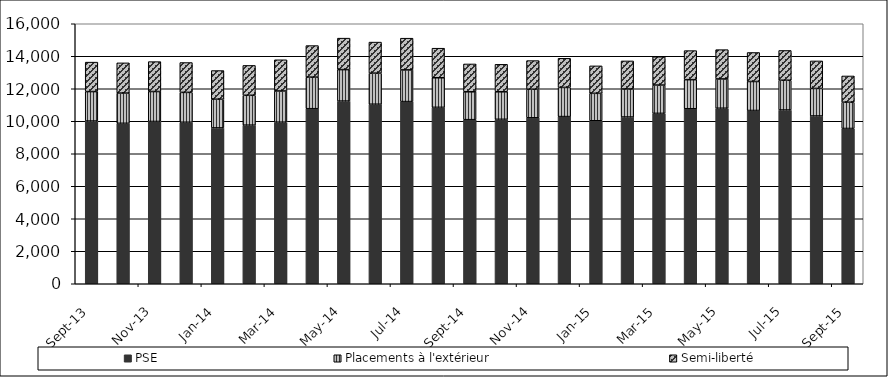
| Category | PSE | Placements à l'extérieur | Semi-liberté |
|---|---|---|---|
| 2013-09-01 | 10013 | 1813 | 1813 |
| 2013-10-01 | 9874 | 1860 | 1860 |
| 2013-11-01 | 9987 | 1842 | 1842 |
| 2013-12-01 | 9938 | 1838 | 1838 |
| 2014-01-01 | 9591 | 1765 | 1765 |
| 2014-02-01 | 9760 | 1838 | 1838 |
| 2014-03-01 | 9943 | 1920 | 1920 |
| 2014-04-01 | 10773 | 1942 | 1942 |
| 2014-05-01 | 11241 | 1937 | 1937 |
| 2014-06-01 | 11048 | 1912 | 1912 |
| 2014-07-01 | 11210 | 1951 | 1951 |
| 2014-08-01 | 10856 | 1820 | 1820 |
| 2014-09-01 | 10098 | 1714 | 1714 |
| 2014-10-01 | 10120 | 1692 | 1692 |
| 2014-11-01 | 10213 | 1760 | 1760 |
| 2014-12-01 | 10287 | 1794 | 1794 |
| 2015-01-01 | 10030 | 1689 | 1689 |
| 2015-02-01 | 10261 | 1726 | 1726 |
| 2015-03-01 | 10485 | 1742 | 1742 |
| 2015-04-01 | 10770 | 1789 | 1789 |
| 2015-05-01 | 10801 | 1803 | 1803 |
| 2015-06-01 | 10662 | 1785 | 1785 |
| 2015-07-01 | 10692 | 1832 | 1832 |
| 2015-08-01 | 10325 | 1694 | 1694 |
| 2015-09-01 | 9555 | 1616 | 1616 |